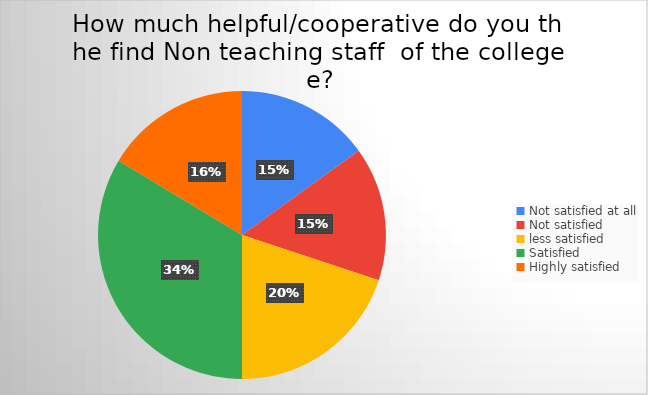
| Category | Series 0 |
|---|---|
| Not satisfied at all | 34 |
| Not satisfied  | 34 |
| less satisfied | 45 |
| Satisfied | 76 |
| Highly satisfied | 37 |